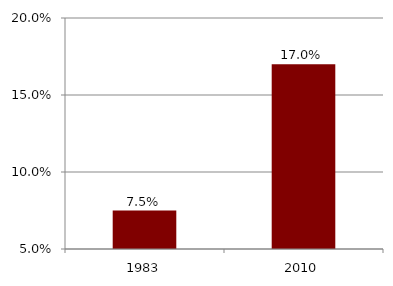
| Category | Series 0 |
|---|---|
| 1983.0 | 0.075 |
| 2010.0 | 0.17 |